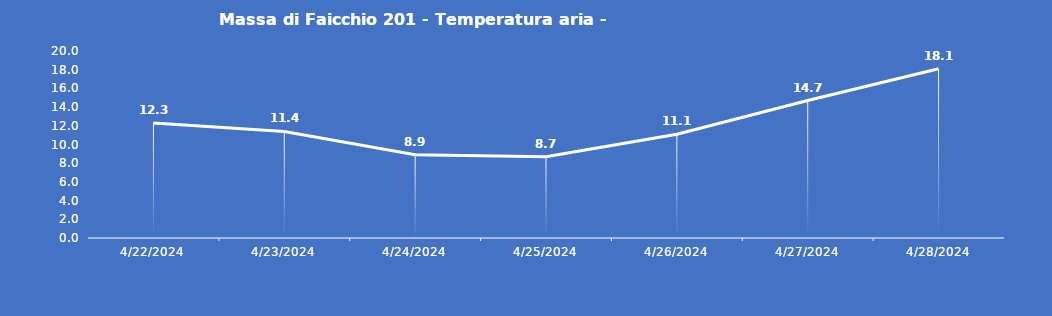
| Category | Massa di Faicchio 201 - Temperatura aria - Grezzo (°C) |
|---|---|
| 4/22/24 | 12.3 |
| 4/23/24 | 11.4 |
| 4/24/24 | 8.9 |
| 4/25/24 | 8.7 |
| 4/26/24 | 11.1 |
| 4/27/24 | 14.7 |
| 4/28/24 | 18.1 |